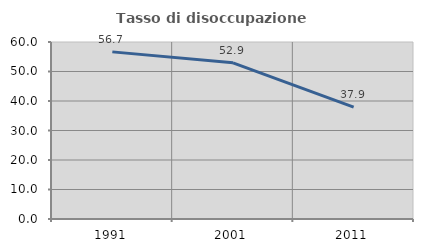
| Category | Tasso di disoccupazione giovanile  |
|---|---|
| 1991.0 | 56.654 |
| 2001.0 | 52.941 |
| 2011.0 | 37.931 |